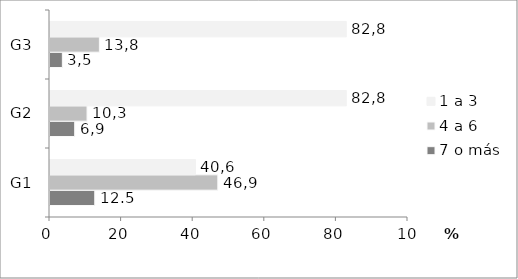
| Category | 7 o más | 4 a 6 | 1 a 3 |
|---|---|---|---|
| G1 | 12.5 | 46.875 | 40.625 |
| G2 | 6.897 | 10.345 | 82.759 |
| G3 | 3.448 | 13.793 | 82.759 |